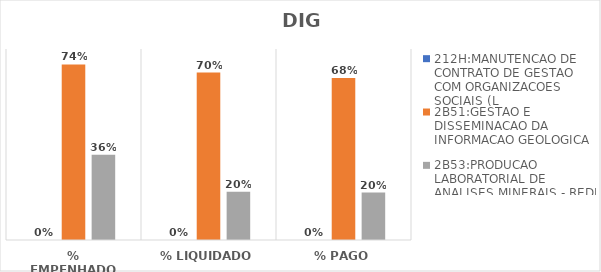
| Category | 212H:MANUTENCAO DE CONTRATO DE GESTAO COM ORGANIZACOES SOCIAIS (L | 2B51:GESTAO E DISSEMINACAO DA INFORMACAO GEOLOGICA | 2B53:PRODUCAO LABORATORIAL DE ANALISES MINERAIS - REDE LAMIN |
|---|---|---|---|
| % EMPENHADO | 0 | 0.735 | 0.358 |
| % LIQUIDADO | 0 | 0.701 | 0.202 |
| % PAGO | 0 | 0.679 | 0.199 |